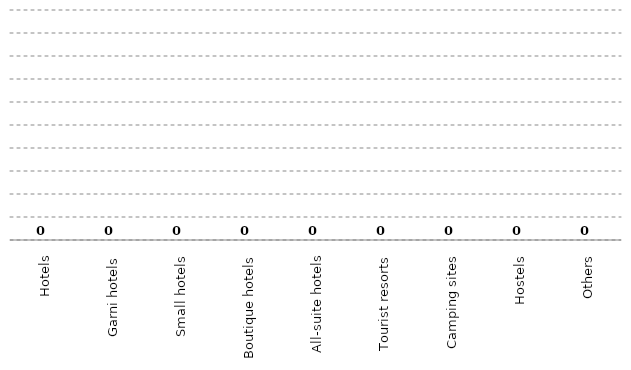
| Category | Series 0 |
|---|---|
| Hotels | 0 |
| Garni hotels | 0 |
| Small hotels | 0 |
| Boutique hotels | 0 |
| All-suite hotels | 0 |
| Tourist resorts | 0 |
| Camping sites | 0 |
| Hostels | 0 |
| Others | 0 |